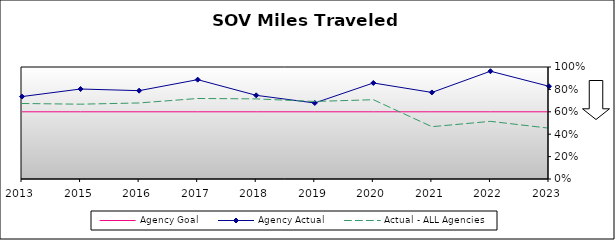
| Category | Agency Goal | Agency Actual | Actual - ALL Agencies |
|---|---|---|---|
| 2013.0 | 0.6 | 0.736 | 0.674 |
| 2015.0 | 0.6 | 0.804 | 0.668 |
| 2016.0 | 0.6 | 0.789 | 0.679 |
| 2017.0 | 0.6 | 0.887 | 0.719 |
| 2018.0 | 0.6 | 0.747 | 0.715 |
| 2019.0 | 0.6 | 0.679 | 0.692 |
| 2020.0 | 0.6 | 0.857 | 0.708 |
| 2021.0 | 0.6 | 0.773 | 0.467 |
| 2022.0 | 0.6 | 0.962 | 0.515 |
| 2023.0 | 0.6 | 0.828 | 0.454 |